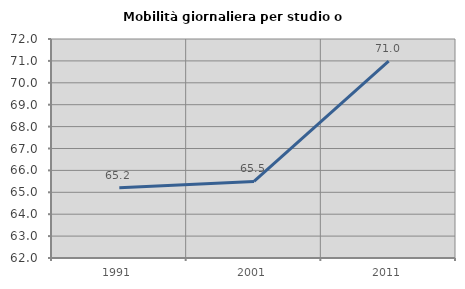
| Category | Mobilità giornaliera per studio o lavoro |
|---|---|
| 1991.0 | 65.211 |
| 2001.0 | 65.494 |
| 2011.0 | 70.989 |